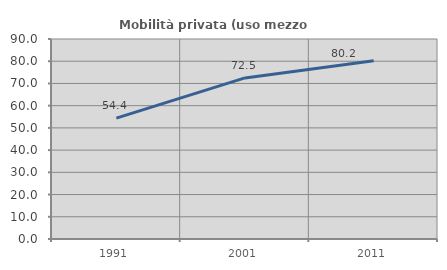
| Category | Mobilità privata (uso mezzo privato) |
|---|---|
| 1991.0 | 54.385 |
| 2001.0 | 72.493 |
| 2011.0 | 80.204 |